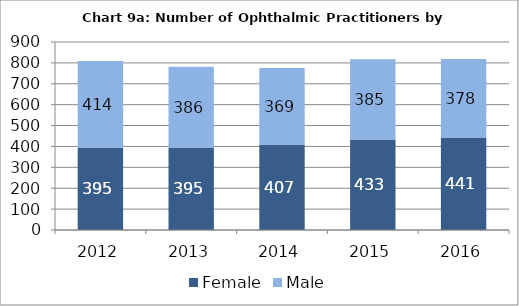
| Category | Female | Male |
|---|---|---|
| 2012.0 | 395 | 414 |
| 2013.0 | 395 | 386 |
| 2014.0 | 407 | 369 |
| 2015.0 | 433 | 385 |
| 2016.0 | 441 | 378 |